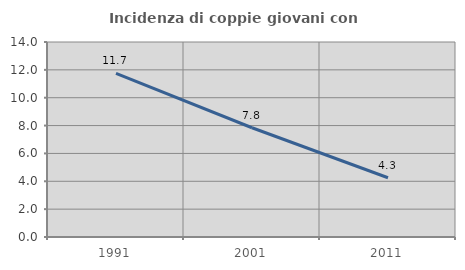
| Category | Incidenza di coppie giovani con figli |
|---|---|
| 1991.0 | 11.747 |
| 2001.0 | 7.843 |
| 2011.0 | 4.253 |